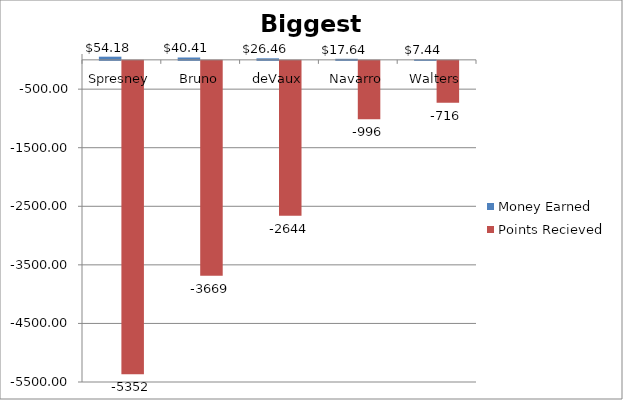
| Category | Money Earned | Points Recieved |
|---|---|---|
| Spresney | 54.18 | -5352 |
| Bruno | 40.41 | -3669 |
| deVaux | 26.46 | -2644 |
| Navarro | 17.64 | -996 |
| Walters | 7.44 | -716 |